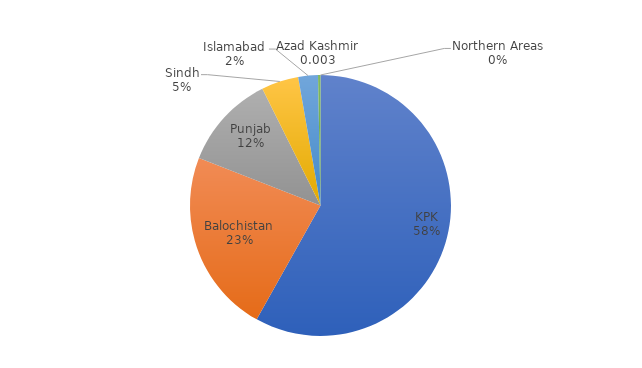
| Category | Series 0 | Series 1 |
|---|---|---|
| KPK | 834387 |  |
| Balochistan | 327247 |  |
| Punjab | 168351 |  |
| Sindh | 66111 |  |
| Islamabad | 35003 |  |
| Azad Kashmir | 4341 |  |
| Northern Areas | 5 |  |